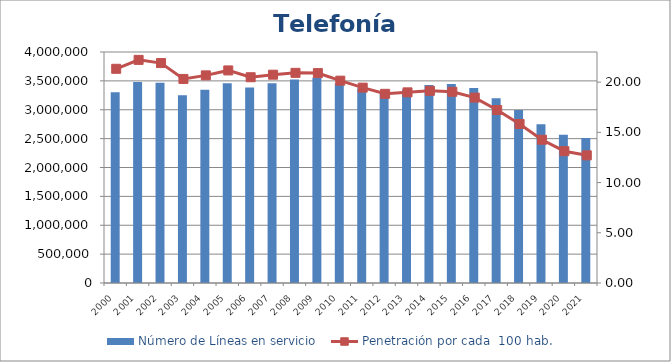
| Category | Número de Líneas en servicio |
|---|---|
| 2000.0 | 3302498 |
| 2001.0 | 3478492 |
| 2002.0 | 3467013 |
| 2003.0 | 3252063 |
| 2004.0 | 3345102 |
| 2005.0 | 3460645 |
| 2006.0 | 3383597 |
| 2007.0 | 3459611 |
| 2008.0 | 3524790 |
| 2009.0 | 3555311 |
| 2010.0 | 3459367 |
| 2011.0 | 3370104 |
| 2012.0 | 3292502 |
| 2013.0 | 3347231 |
| 2014.0 | 3427749 |
| 2015.0 | 3445880 |
| 2016.0 | 3375037 |
| 2017.0 | 3200245 |
| 2018.0 | 2997192 |
| 2019.0 | 2750272 |
| 2020.0 | 2567938 |
| 2021.0 | 2510972 |